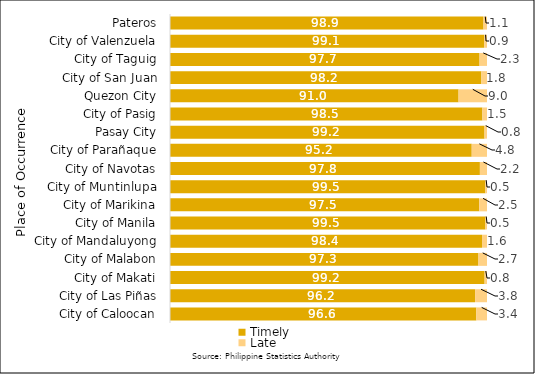
| Category | Timely | Late |
|---|---|---|
|  City of Caloocan | 96.64 | 3.36 |
|  City of Las Piñas | 96.249 | 3.751 |
|  City of Makati | 99.248 | 0.752 |
|  City of Malabon | 97.307 | 2.693 |
|  City of Mandaluyong | 98.432 | 1.568 |
|  City of Manila | 99.506 | 0.494 |
|  City of Marikina | 97.534 | 2.466 |
|  City of Muntinlupa | 99.478 | 0.522 |
|  City of Navotas | 97.758 | 2.242 |
|  City of Parañaque | 95.182 | 4.818 |
|  Pasay City | 99.213 | 0.787 |
|  City of Pasig | 98.546 | 1.454 |
|  Quezon City | 91.03 | 8.97 |
|  City of San Juan | 98.23 | 1.77 |
|  City of Taguig | 97.652 | 2.348 |
|  City of Valenzuela | 99.117 | 0.883 |
|  Pateros | 98.901 | 1.099 |